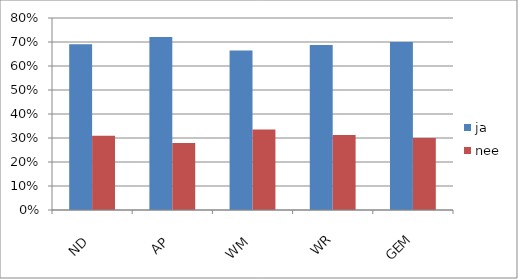
| Category | ja | nee |
|---|---|---|
| ND | 0.691 | 0.309 |
| AP | 0.721 | 0.279 |
| WM | 0.665 | 0.335 |
| WR | 0.687 | 0.313 |
| GEM | 0.7 | 0.3 |